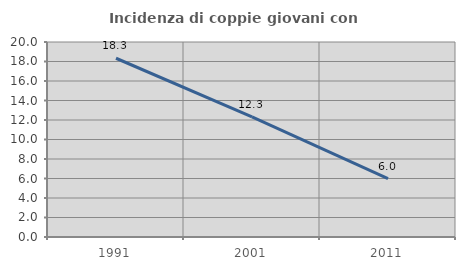
| Category | Incidenza di coppie giovani con figli |
|---|---|
| 1991.0 | 18.333 |
| 2001.0 | 12.329 |
| 2011.0 | 5.978 |